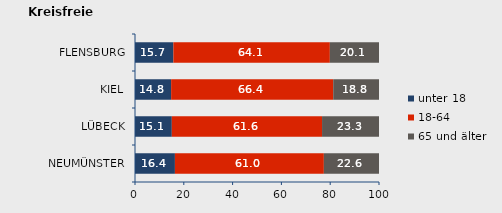
| Category | unter 18 | 18-64 | 65 und älter |
|---|---|---|---|
| NEUMÜNSTER | 16.36 | 61.04 | 22.6 |
| LÜBECK | 15.089 | 61.572 | 23.339 |
| KIEL | 14.808 | 66.441 | 18.751 |
| FLENSBURG | 15.732 | 64.125 | 20.142 |